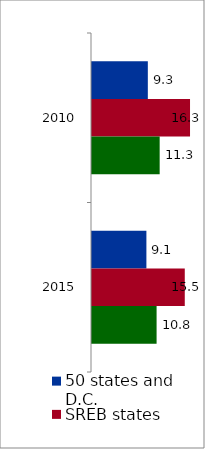
| Category | 50 states and D.C. | SREB states | State |
|---|---|---|---|
| 2010.0 | 9.305 | 16.337 | 11.279 |
| 2015.0 | 9.067 | 15.463 | 10.766 |